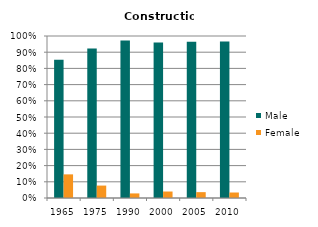
| Category | Male | Female |
|---|---|---|
| 1965.0 | 0.854 | 0.146 |
| 1975.0 | 0.923 | 0.077 |
| 1990.0 | 0.972 | 0.028 |
| 2000.0 | 0.96 | 0.04 |
| 2005.0 | 0.964 | 0.036 |
| 2010.0 | 0.966 | 0.034 |